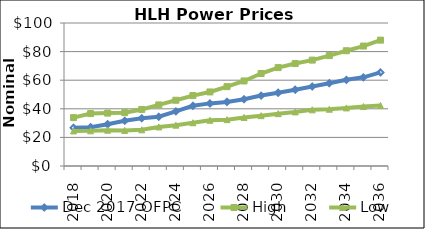
| Category | Dec 2017 OFPC | High | Low |
|---|---|---|---|
| 2018.0 | 26.759 | 33.825 | 24.528 |
| 2019.0 | 27.142 | 36.665 | 24.597 |
| 2020.0 | 29.213 | 36.997 | 25.038 |
| 2021.0 | 31.645 | 37.306 | 24.859 |
| 2022.0 | 33.343 | 39.545 | 25.291 |
| 2023.0 | 34.456 | 42.721 | 27.324 |
| 2024.0 | 38.214 | 45.986 | 28.572 |
| 2025.0 | 42.106 | 49.252 | 30.241 |
| 2026.0 | 43.782 | 51.784 | 31.982 |
| 2027.0 | 44.825 | 55.498 | 32.421 |
| 2028.0 | 46.668 | 59.468 | 33.938 |
| 2029.0 | 49.245 | 64.689 | 35.199 |
| 2030.0 | 51.226 | 68.812 | 36.587 |
| 2031.0 | 53.38 | 71.646 | 37.838 |
| 2032.0 | 55.596 | 74.055 | 39.285 |
| 2033.0 | 57.905 | 77.219 | 39.702 |
| 2034.0 | 60.281 | 80.61 | 40.616 |
| 2035.0 | 61.998 | 83.878 | 41.576 |
| 2036.0 | 65.454 | 88.021 | 42.33 |